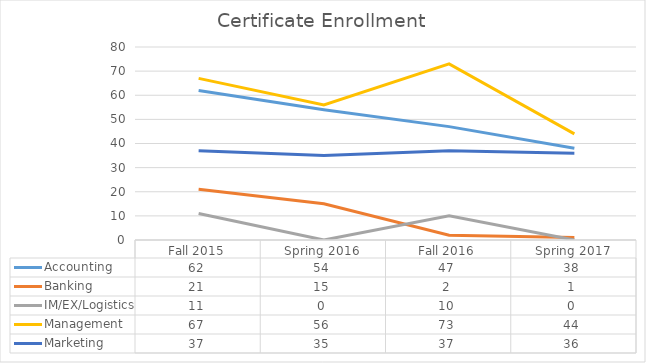
| Category | Accounting | Banking | IM/EX/Logistics | Management | Marketing |
|---|---|---|---|---|---|
| Fall 2015 | 62 | 21 | 11 | 67 | 37 |
| Spring 2016 | 54 | 15 | 0 | 56 | 35 |
| Fall 2016 | 47 | 2 | 10 | 73 | 37 |
| Spring 2017 | 38 | 1 | 0 | 44 | 36 |